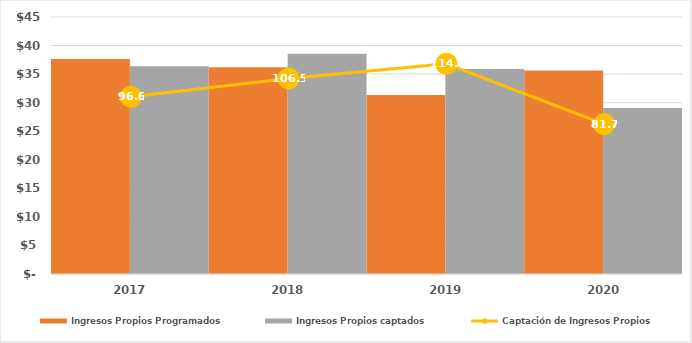
| Category | Ingresos Propios Programados | Ingresos Propios captados |
|---|---|---|
| 2017.0 | 37652.2 | 36357.722 |
| 2018.0 | 36202.904 | 38547 |
| 2019.0 | 31360.433 | 35900.04 |
| 2020.0 | 35617.842 | 29082.971 |